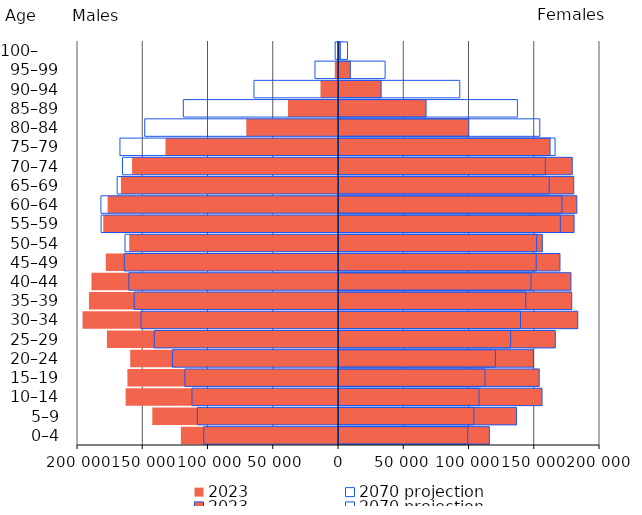
| Category | 2023 | 2070 projection |
|---|---|---|
| 0–4 | 115211 | 98675 |
| 5–9 | 136012 | 103340 |
| 10–14 | 155573 | 107315 |
| 15–19 | 153424 | 111910 |
| 20–24 | 148987 | 119832 |
| 25–29 | 165738 | 131518 |
| 30–34 | 182972 | 139035 |
| 35–39 | 178335 | 143112 |
| 40–44 | 177751 | 147183 |
| 45–49 | 169327 | 151106 |
| 50–54 | 155810 | 151443 |
| 55–59 | 180155 | 169578 |
| 60–64 | 182260 | 170887 |
| 65–69 | 179869 | 161040 |
| 70–74 | 178732 | 158084 |
| 75–79 | 161722 | 165589 |
| 80–84 | 99450 | 153874 |
| 85–89 | 66715 | 136731 |
| 90–94 | 32267 | 92552 |
| 95–99 | 8664 | 35341 |
| 100–     | 979 | 6515 |